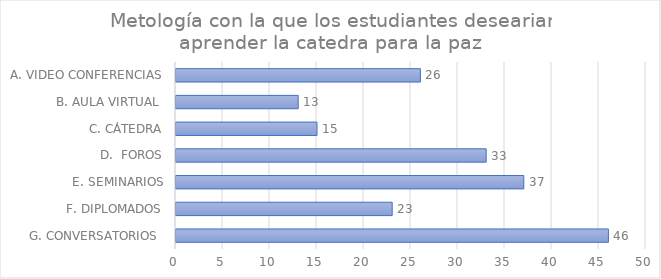
| Category | Series 0 |
|---|---|
| G. CONVERSATORIOS  | 46 |
| F. DIPLOMADOS | 23 |
| E. SEMINARIOS | 37 |
| D.  FOROS | 33 |
| C. CÁTEDRA | 15 |
| B. AULA VIRTUAL  | 13 |
| A. VIDEO CONFERENCIAS | 26 |